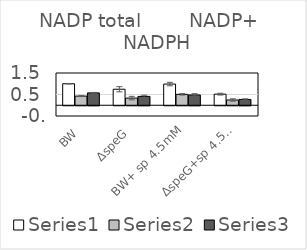
| Category | Series 0 | Series 1 | Series 2 |
|---|---|---|---|
| BW | 1 | 0.426 | 0.574 |
| ΔspeG | 0.744 | 0.333 | 0.412 |
| BW+ sp 4.5mM | 0.986 | 0.507 | 0.479 |
| ΔspeG+sp 4.5mM | 0.516 | 0.245 | 0.27 |